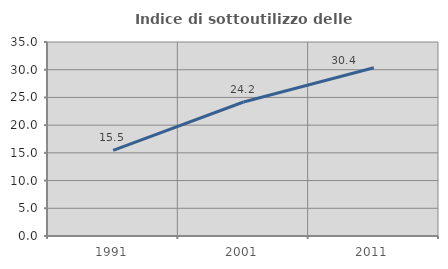
| Category | Indice di sottoutilizzo delle abitazioni  |
|---|---|
| 1991.0 | 15.465 |
| 2001.0 | 24.173 |
| 2011.0 | 30.355 |